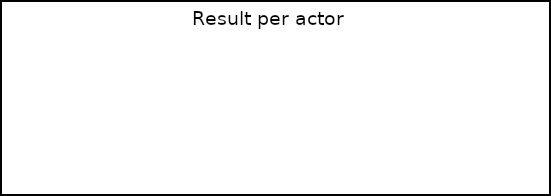
| Category | Series 0 |
|---|---|
| Operator | -16348687.441 |
| Swedish Transport Administration | -4125000 |
| Haulage contractor | -3903971.562 |
| Electricity grid operator | -10443046.875 |
| Electricity supplier | 0 |
| Vehicle manufacturer | 0 |
| The State | -1520077.289 |